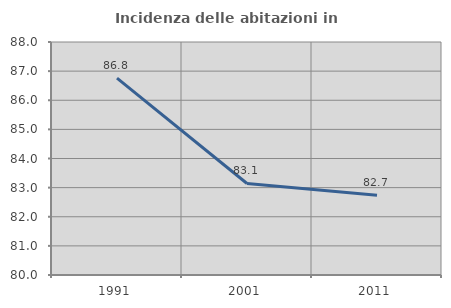
| Category | Incidenza delle abitazioni in proprietà  |
|---|---|
| 1991.0 | 86.759 |
| 2001.0 | 83.142 |
| 2011.0 | 82.737 |